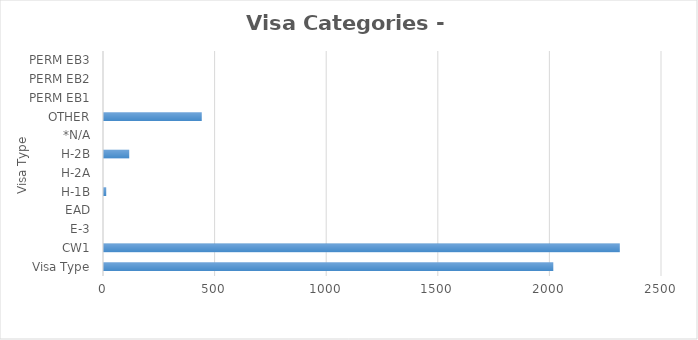
| Category | Series 0 |
|---|---|
| Visa Type | 2013 |
| CW1 | 2311 |
| E-3 | 0 |
| EAD | 0 |
| H-1B | 10 |
| H-2A | 0 |
| H-2B | 113 |
| *N/A | 0 |
| OTHER | 438 |
| PERM EB1 | 0 |
| PERM EB2 | 0 |
| PERM EB3 | 0 |